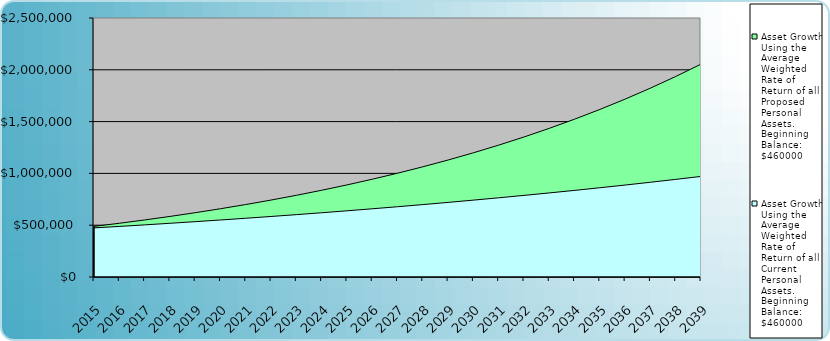
| Category | Asset Growth Using the Average Weighted Rate of Return of all Proposed Personal Assets. Beginning Balance: $460000 | Asset Growth Using the Average Weighted Rate of Return of all Current Personal Assets. Beginning Balance: $460000 |
|---|---|---|
| 2015.0 | 488380 | 473950 |
| 2016.0 | 518510.923 | 488323.049 |
| 2017.0 | 550500.792 | 503131.976 |
| 2018.0 | 584464.298 | 518390 |
| 2019.0 | 620523.204 | 534110.74 |
| 2020.0 | 658806.787 | 550308.229 |
| 2021.0 | 699452.302 | 566996.924 |
| 2022.0 | 742605.468 | 584191.722 |
| 2023.0 | 788420.996 | 601907.971 |
| 2024.0 | 837063.144 | 620161.485 |
| 2025.0 | 888706.3 | 638968.556 |
| 2026.0 | 943535.615 | 658345.972 |
| 2027.0 | 1001747.66 | 678311.029 |
| 2028.0 | 1063551.135 | 698881.548 |
| 2029.0 | 1129167.616 | 720075.891 |
| 2030.0 | 1198832.349 | 741912.975 |
| 2031.0 | 1272795.092 | 764412.293 |
| 2032.0 | 1351321.016 | 787593.926 |
| 2033.0 | 1434691.647 | 811478.568 |
| 2034.0 | 1523205.884 | 836087.538 |
| 2035.0 | 1617181.064 | 861442.801 |
| 2036.0 | 1716954.105 | 887566.99 |
| 2037.0 | 1822882.708 | 914483.424 |
| 2038.0 | 1935346.646 | 942216.128 |
| 2039.0 | 2054749.119 | 970789.856 |